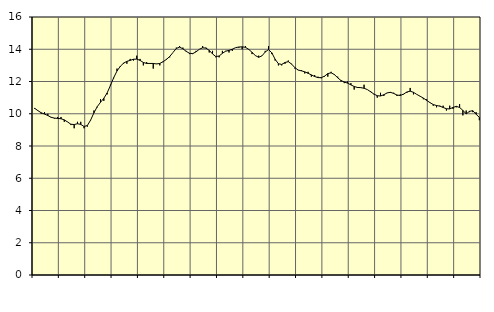
| Category | Piggar | Series 1 |
|---|---|---|
| nan | 10.3 | 10.34 |
| 87.0 | 10.2 | 10.19 |
| 87.0 | 10 | 10.06 |
| 87.0 | 10.1 | 9.98 |
| nan | 10 | 9.89 |
| 88.0 | 9.8 | 9.78 |
| 88.0 | 9.7 | 9.73 |
| 88.0 | 9.8 | 9.71 |
| nan | 9.8 | 9.69 |
| 89.0 | 9.5 | 9.62 |
| 89.0 | 9.5 | 9.49 |
| 89.0 | 9.3 | 9.35 |
| nan | 9.1 | 9.33 |
| 90.0 | 9.5 | 9.38 |
| 90.0 | 9.5 | 9.34 |
| 90.0 | 9.1 | 9.21 |
| nan | 9.2 | 9.27 |
| 91.0 | 9.6 | 9.61 |
| 91.0 | 10.2 | 10.06 |
| 91.0 | 10.4 | 10.44 |
| nan | 10.9 | 10.71 |
| 92.0 | 10.8 | 10.96 |
| 92.0 | 11.2 | 11.29 |
| 92.0 | 11.8 | 11.75 |
| nan | 12.2 | 12.24 |
| 93.0 | 12.8 | 12.65 |
| 93.0 | 12.9 | 12.94 |
| 93.0 | 13.1 | 13.14 |
| nan | 13.1 | 13.25 |
| 94.0 | 13.4 | 13.31 |
| 94.0 | 13.3 | 13.38 |
| 94.0 | 13.6 | 13.39 |
| nan | 13.4 | 13.31 |
| 95.0 | 13 | 13.18 |
| 95.0 | 13.2 | 13.12 |
| 95.0 | 13.1 | 13.12 |
| nan | 12.8 | 13.12 |
| 96.0 | 13.1 | 13.09 |
| 96.0 | 13 | 13.12 |
| 96.0 | 13.2 | 13.23 |
| nan | 13.4 | 13.37 |
| 97.0 | 13.5 | 13.55 |
| 97.0 | 13.8 | 13.8 |
| 97.0 | 14.1 | 14.05 |
| nan | 14.2 | 14.13 |
| 98.0 | 14.1 | 14.03 |
| 98.0 | 13.9 | 13.87 |
| 98.0 | 13.7 | 13.75 |
| nan | 13.7 | 13.73 |
| 99.0 | 13.9 | 13.84 |
| 99.0 | 14 | 14 |
| 99.0 | 14.2 | 14.09 |
| nan | 14.1 | 14.07 |
| 0.0 | 13.8 | 13.93 |
| 0.0 | 13.9 | 13.71 |
| 0.0 | 13.5 | 13.55 |
| nan | 13.5 | 13.58 |
| 1.0 | 13.9 | 13.75 |
| 1.0 | 13.9 | 13.88 |
| 1.0 | 13.8 | 13.93 |
| nan | 13.9 | 14 |
| 2.0 | 14.1 | 14.1 |
| 2.0 | 14.1 | 14.14 |
| 2.0 | 14 | 14.15 |
| nan | 14.2 | 14.12 |
| 3.0 | 14 | 13.99 |
| 3.0 | 13.7 | 13.81 |
| 3.0 | 13.6 | 13.61 |
| nan | 13.6 | 13.5 |
| 4.0 | 13.6 | 13.59 |
| 4.0 | 13.9 | 13.83 |
| 4.0 | 14.2 | 13.98 |
| nan | 13.7 | 13.78 |
| 5.0 | 13.3 | 13.38 |
| 5.0 | 13 | 13.1 |
| 5.0 | 13 | 13.06 |
| nan | 13.1 | 13.18 |
| 6.0 | 13.3 | 13.23 |
| 6.0 | 13.1 | 13.08 |
| 6.0 | 12.8 | 12.86 |
| nan | 12.7 | 12.71 |
| 7.0 | 12.7 | 12.66 |
| 7.0 | 12.5 | 12.6 |
| 7.0 | 12.6 | 12.51 |
| nan | 12.3 | 12.41 |
| 8.0 | 12.4 | 12.31 |
| 8.0 | 12.3 | 12.24 |
| 8.0 | 12.2 | 12.24 |
| nan | 12.3 | 12.33 |
| 9.0 | 12.3 | 12.49 |
| 9.0 | 12.6 | 12.54 |
| 9.0 | 12.4 | 12.43 |
| nan | 12.3 | 12.23 |
| 10.0 | 12 | 12.06 |
| 10.0 | 11.9 | 11.97 |
| 10.0 | 12 | 11.9 |
| nan | 11.9 | 11.79 |
| 11.0 | 11.5 | 11.69 |
| 11.0 | 11.6 | 11.63 |
| 11.0 | 11.6 | 11.62 |
| nan | 11.8 | 11.58 |
| 12.0 | 11.5 | 11.5 |
| 12.0 | 11.4 | 11.36 |
| 12.0 | 11.2 | 11.22 |
| nan | 11 | 11.12 |
| 13.0 | 11.3 | 11.1 |
| 13.0 | 11.1 | 11.18 |
| 13.0 | 11.3 | 11.29 |
| nan | 11.3 | 11.33 |
| 14.0 | 11.3 | 11.26 |
| 14.0 | 11.1 | 11.16 |
| 14.0 | 11.2 | 11.13 |
| nan | 11.2 | 11.22 |
| 15.0 | 11.3 | 11.35 |
| 15.0 | 11.6 | 11.4 |
| 15.0 | 11.2 | 11.33 |
| nan | 11.2 | 11.2 |
| 16.0 | 11.1 | 11.09 |
| 16.0 | 10.9 | 10.97 |
| 16.0 | 10.9 | 10.83 |
| nan | 10.7 | 10.69 |
| 17.0 | 10.5 | 10.57 |
| 17.0 | 10.4 | 10.51 |
| 17.0 | 10.5 | 10.47 |
| nan | 10.5 | 10.39 |
| 18.0 | 10.2 | 10.31 |
| 18.0 | 10.5 | 10.3 |
| 18.0 | 10.3 | 10.39 |
| nan | 10.4 | 10.46 |
| 19.0 | 10.6 | 10.39 |
| 19.0 | 9.9 | 10.21 |
| 19.0 | 10.2 | 9.99 |
| nan | 10.1 | 10.15 |
| 20.0 | 10.1 | 10.19 |
| 20.0 | 10.1 | 9.97 |
| 20.0 | 9.6 | 9.78 |